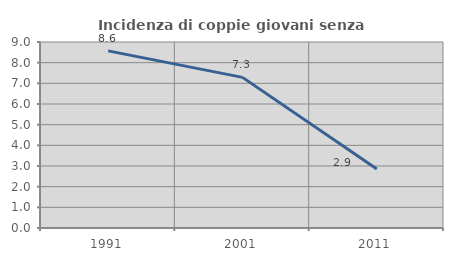
| Category | Incidenza di coppie giovani senza figli |
|---|---|
| 1991.0 | 8.571 |
| 2001.0 | 7.289 |
| 2011.0 | 2.85 |